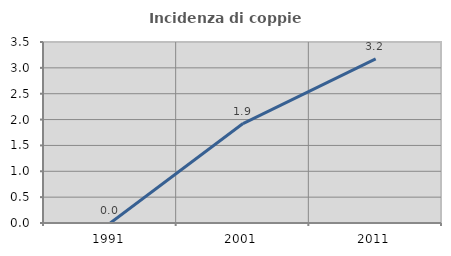
| Category | Incidenza di coppie miste |
|---|---|
| 1991.0 | 0 |
| 2001.0 | 1.923 |
| 2011.0 | 3.175 |